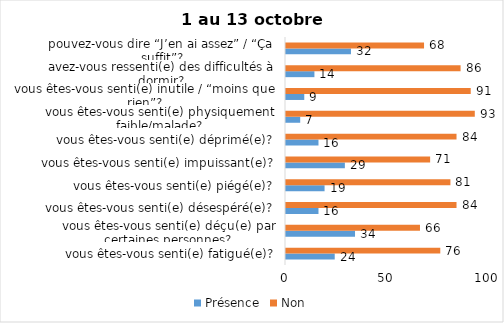
| Category | Présence | Non |
|---|---|---|
| vous êtes-vous senti(e) fatigué(e)? | 24 | 76 |
| vous êtes-vous senti(e) déçu(e) par certaines personnes? | 34 | 66 |
| vous êtes-vous senti(e) désespéré(e)? | 16 | 84 |
| vous êtes-vous senti(e) piégé(e)? | 19 | 81 |
| vous êtes-vous senti(e) impuissant(e)? | 29 | 71 |
| vous êtes-vous senti(e) déprimé(e)? | 16 | 84 |
| vous êtes-vous senti(e) physiquement faible/malade? | 7 | 93 |
| vous êtes-vous senti(e) inutile / “moins que rien”? | 9 | 91 |
| avez-vous ressenti(e) des difficultés à dormir? | 14 | 86 |
| pouvez-vous dire “J’en ai assez” / “Ça suffit”? | 32 | 68 |